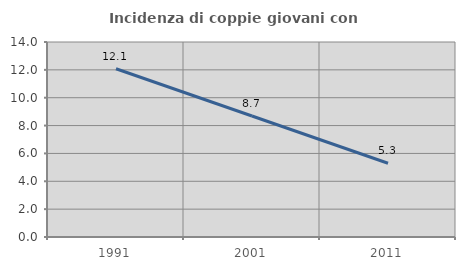
| Category | Incidenza di coppie giovani con figli |
|---|---|
| 1991.0 | 12.077 |
| 2001.0 | 8.689 |
| 2011.0 | 5.295 |